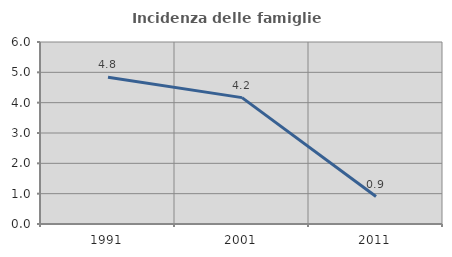
| Category | Incidenza delle famiglie numerose |
|---|---|
| 1991.0 | 4.839 |
| 2001.0 | 4.167 |
| 2011.0 | 0.905 |